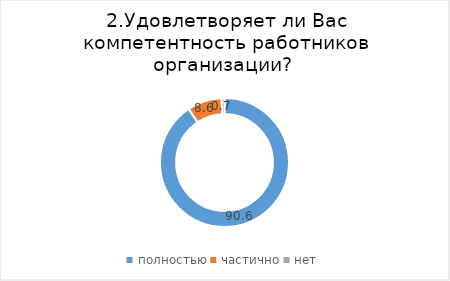
| Category | Series 0 |
|---|---|
| полностью | 90.629 |
| частично | 8.631 |
| нет | 0.74 |